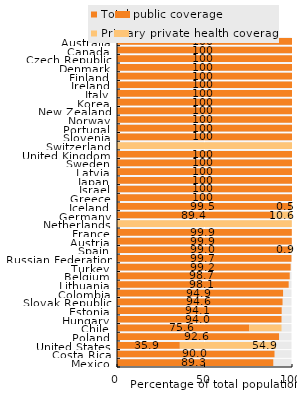
| Category | Total public coverage | Primary private health coverage |
|---|---|---|
| Mexico | 89.3 | 0 |
| Costa Rica | 90 | 0 |
| United States | 35.9 | 54.9 |
| Poland | 92.6 | 0 |
| Chile | 75.6 | 18.4 |
| Hungary | 94 | 0 |
| Estonia | 94.1 | 0 |
| Slovak Republic | 94.6 | 0 |
| Colombia | 94.9 | 0 |
| Lithuania | 98.1 | 0 |
| Belgium | 98.7 | 0 |
| Turkey | 99.2 | 0 |
| Russian Federation | 99.7 | 0 |
| Spain | 99 | 0.9 |
| Austria | 99.9 | 0 |
| France | 99.9 | 0 |
| Netherlands | 0 | 99.9 |
| Germany | 89.4 | 10.6 |
| Iceland | 99.5 | 0.5 |
| Greece | 100 | 0 |
| Israel | 100 | 0 |
| Japan | 100 | 0 |
| Latvia | 100 | 0 |
| Sweden | 100 | 0 |
| United Kingdom | 100 | 0 |
| Switzerland | 0 | 100 |
| Slovenia | 100 | 0 |
| Portugal | 100 | 0 |
| Norway | 100 | 0 |
| New Zealand | 100 | 0 |
| Korea | 100 | 0 |
| Italy | 100 | 0 |
| Ireland | 100 | 0 |
| Finland | 100 | 0 |
| Denmark | 100 | 0 |
| Czech Republic | 100 | 0 |
| Canada | 100 | 0 |
| Australia | 100 | 0 |